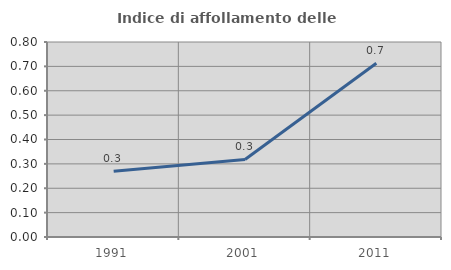
| Category | Indice di affollamento delle abitazioni  |
|---|---|
| 1991.0 | 0.269 |
| 2001.0 | 0.318 |
| 2011.0 | 0.713 |